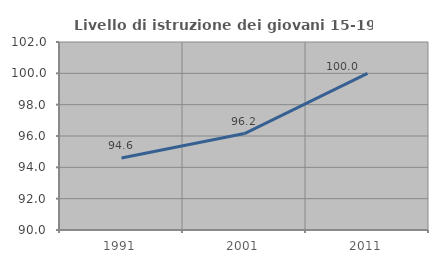
| Category | Livello di istruzione dei giovani 15-19 anni |
|---|---|
| 1991.0 | 94.595 |
| 2001.0 | 96.154 |
| 2011.0 | 100 |